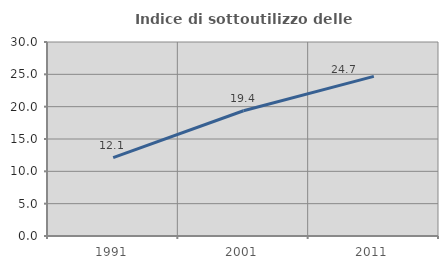
| Category | Indice di sottoutilizzo delle abitazioni  |
|---|---|
| 1991.0 | 12.108 |
| 2001.0 | 19.372 |
| 2011.0 | 24.684 |